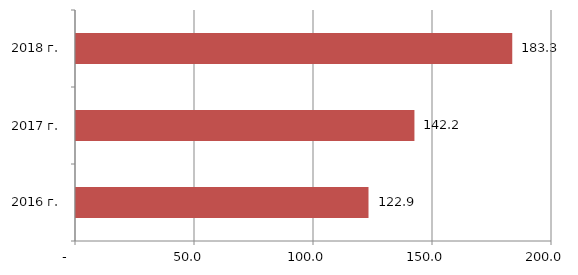
| Category | Series 0 |
|---|---|
| 2016 г. | 122.9 |
| 2017 г. | 142.2 |
| 2018 г. | 183.3 |